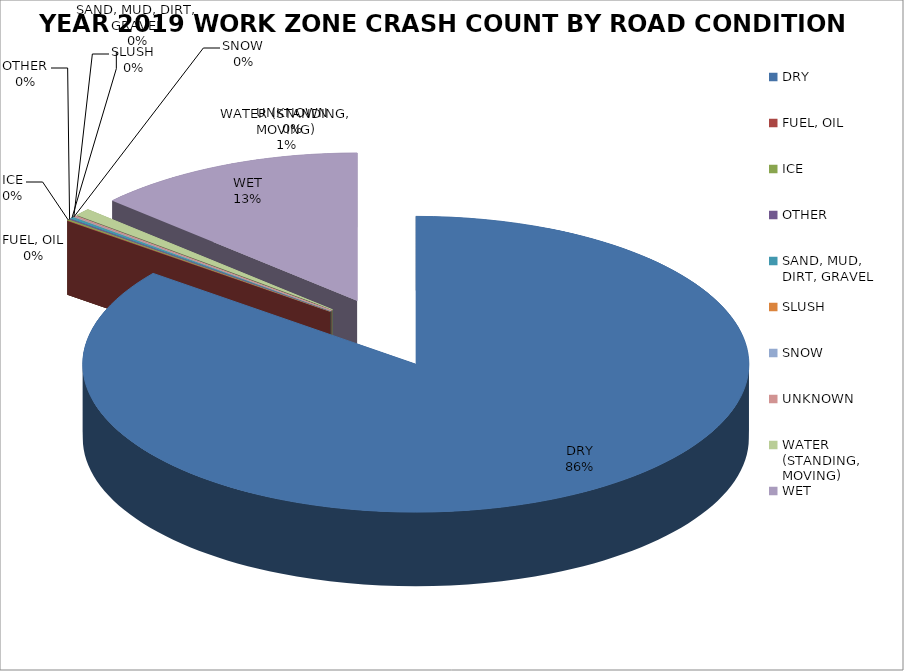
| Category | YEAR 2019 WORK ZONE CRASH COUNT* |
|---|---|
| DRY | 0.855 |
| FUEL, OIL | 0 |
| ICE | 0.001 |
| OTHER | 0.001 |
| SAND, MUD, DIRT, GRAVEL | 0.002 |
| SLUSH | 0 |
| SNOW | 0 |
| UNKNOWN | 0.001 |
| WATER (STANDING, MOVING) | 0.008 |
| WET | 0.131 |